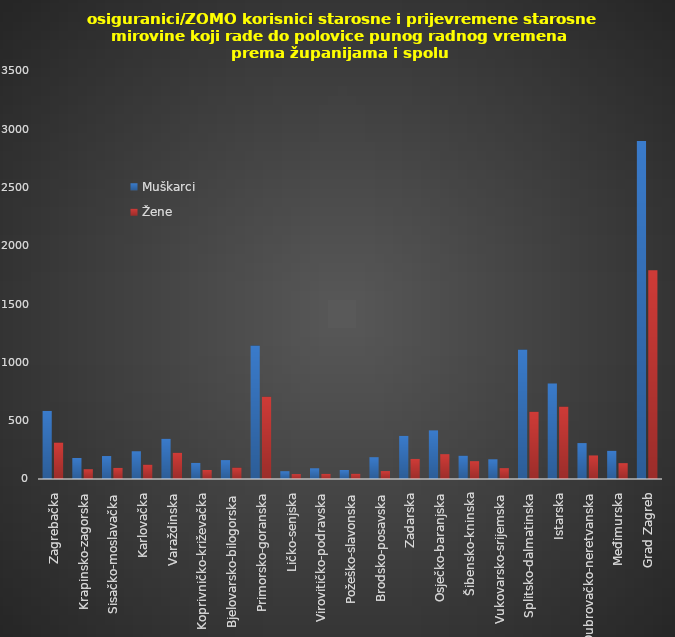
| Category | Muškarci | Žene |
|---|---|---|
| Zagrebačka | 584 | 313 |
| Krapinsko-zagorska | 180 | 84 |
| Sisačko-moslavačka | 197 | 95 |
| Karlovačka | 238 | 123 |
| Varaždinska | 345 | 225 |
| Koprivničko-križevačka | 138 | 77 |
| Bjelovarsko-bilogorska | 162 | 98 |
| Primorsko-goranska | 1145 | 706 |
| Ličko-senjska | 67 | 42 |
| Virovitičko-podravska | 92 | 44 |
| Požeško-slavonska | 77 | 45 |
| Brodsko-posavska | 187 | 68 |
| Zadarska | 370 | 172 |
| Osječko-baranjska | 417 | 213 |
| Šibensko-kninska | 200 | 153 |
| Vukovarsko-srijemska | 169 | 93 |
| Splitsko-dalmatinska | 1110 | 577 |
| Istarska | 820 | 621 |
| Dubrovačko-neretvanska | 308 | 202 |
| Međimurska | 242 | 136 |
| Grad Zagreb | 2899 | 1790 |